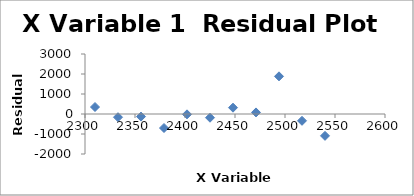
| Category | Series 0 |
|---|---|
| 2310.0 | 349.35 |
| 2333.0 | -160.299 |
| 2356.0 | -130.233 |
| 2379.0 | -700.219 |
| 2402.0 | -17.042 |
| 2425.0 | -186.234 |
| 2448.0 | 316.18 |
| 2471.0 | 78.407 |
| 2494.0 | 1883.068 |
| 2517.0 | -340.074 |
| 2540.0 | -1092.905 |